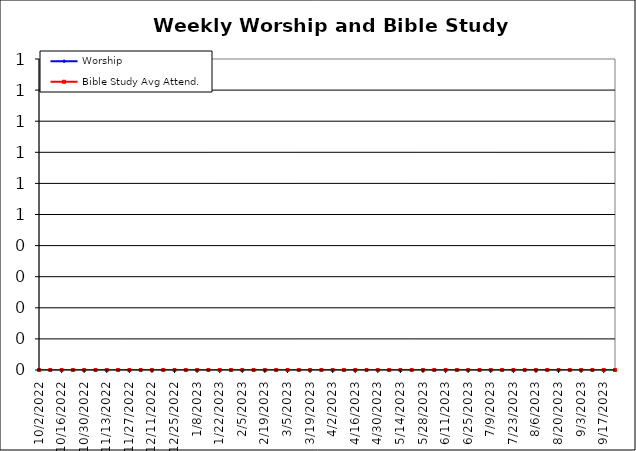
| Category | Worship | Bible Study Avg Attend. |
|---|---|---|
| 10/2/22 | 0 | 0 |
| 10/9/22 | 0 | 0 |
| 10/16/22 | 0 | 0 |
| 10/23/22 | 0 | 0 |
| 10/30/22 | 0 | 0 |
| 11/6/22 | 0 | 0 |
| 11/13/22 | 0 | 0 |
| 11/20/22 | 0 | 0 |
| 11/27/22 | 0 | 0 |
| 12/4/22 | 0 | 0 |
| 12/11/22 | 0 | 0 |
| 12/18/22 | 0 | 0 |
| 12/25/22 | 0 | 0 |
| 1/1/23 | 0 | 0 |
| 1/8/23 | 0 | 0 |
| 1/15/23 | 0 | 0 |
| 1/22/23 | 0 | 0 |
| 1/29/23 | 0 | 0 |
| 2/5/23 | 0 | 0 |
| 2/12/23 | 0 | 0 |
| 2/19/23 | 0 | 0 |
| 2/26/23 | 0 | 0 |
| 3/5/23 | 0 | 0 |
| 3/12/23 | 0 | 0 |
| 3/19/23 | 0 | 0 |
| 3/26/23 | 0 | 0 |
| 4/2/23 | 0 | 0 |
| 4/9/23 | 0 | 0 |
| 4/16/23 | 0 | 0 |
| 4/23/23 | 0 | 0 |
| 4/30/23 | 0 | 0 |
| 5/7/23 | 0 | 0 |
| 5/14/23 | 0 | 0 |
| 5/21/23 | 0 | 0 |
| 5/28/23 | 0 | 0 |
| 6/4/23 | 0 | 0 |
| 6/11/23 | 0 | 0 |
| 6/18/23 | 0 | 0 |
| 6/25/23 | 0 | 0 |
| 7/2/23 | 0 | 0 |
| 7/9/23 | 0 | 0 |
| 7/16/23 | 0 | 0 |
| 7/23/23 | 0 | 0 |
| 7/30/23 | 0 | 0 |
| 8/6/23 | 0 | 0 |
| 8/13/23 | 0 | 0 |
| 8/20/23 | 0 | 0 |
| 8/27/23 | 0 | 0 |
| 9/3/23 | 0 | 0 |
| 9/10/23 | 0 | 0 |
| 9/17/23 | 0 | 0 |
| 9/24/23 | 0 | 0 |